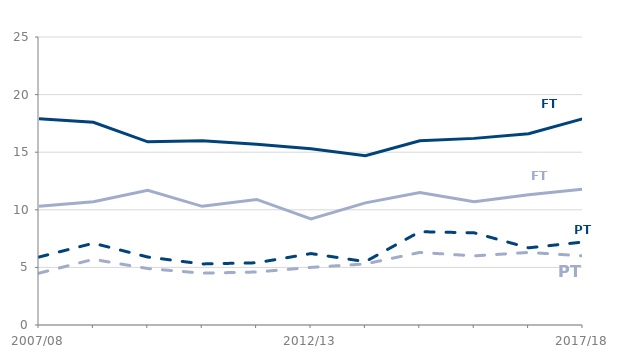
| Category | FT Males | FT Females | PT Males | PT Females |
|---|---|---|---|---|
| 2007/08 | 17900 | 10300 | 5900 | 4500 |
| 2008/09 | 17600 | 10700 | 7100 | 5700 |
| 2009/10 | 15900 | 11700 | 5900 | 4900 |
| 2010/11 | 16000 | 10300 | 5300 | 4500 |
| 2011/12 | 15700 | 10900 | 5400 | 4600 |
| 2012/13 | 15300 | 9200 | 6200 | 5000 |
| 2013/14 | 14700 | 10600 | 5500 | 5300 |
| 2014/15 | 16000 | 11500 | 8100 | 6300 |
| 2015/16 | 16200 | 10700 | 8000 | 6000 |
| 2016/17 | 16600 | 11300 | 6700 | 6300 |
| 2017/18 | 17900 | 11800 | 7200 | 6000 |